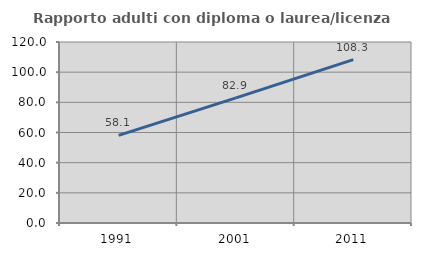
| Category | Rapporto adulti con diploma o laurea/licenza media  |
|---|---|
| 1991.0 | 58.065 |
| 2001.0 | 82.915 |
| 2011.0 | 108.274 |